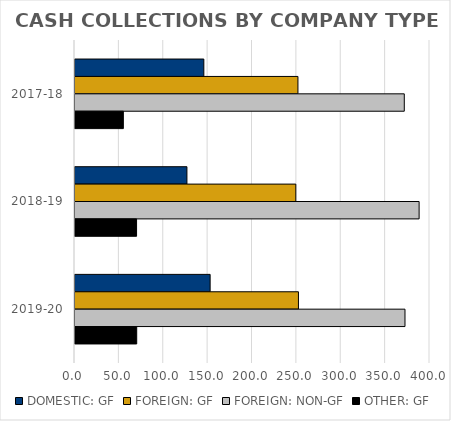
| Category | DOMESTIC: GF | FOREIGN: GF | FOREIGN: NON-GF | OTHER: GF |
|---|---|---|---|---|
| 2017-18 | 145.166 | 251.203 | 371.033 | 54.488 |
| 2018-19 | 126.111 | 248.817 | 387.731 | 69.375 |
| 2019-20 | 152.27 | 251.769 | 371.827 | 69.54 |